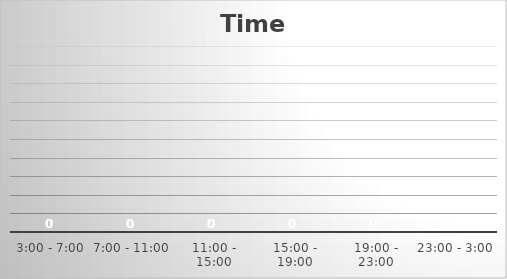
| Category | Time |
|---|---|
| 3:00 - 7:00 | 0 |
| 7:00 - 11:00 | 0 |
| 11:00 - 15:00 | 0 |
| 15:00 - 19:00 | 0 |
| 19:00 - 23:00 | 0 |
| 23:00 - 3:00 | 0 |